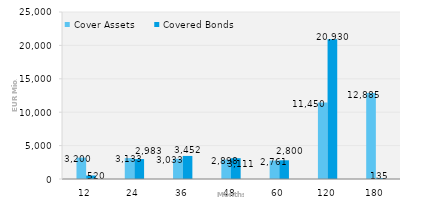
| Category | Cover Assets | Covered Bonds |
|---|---|---|
| 12.0 | 3200.152 | 520 |
| 24.0 | 3133.218 | 2983 |
| 36.0 | 3032.566 | 3452 |
| 48.0 | 2897.763 | 3111 |
| 60.0 | 2761.371 | 2800 |
| 120.0 | 11450.368 | 20930 |
| 180.0 | 12884.569 | 135 |